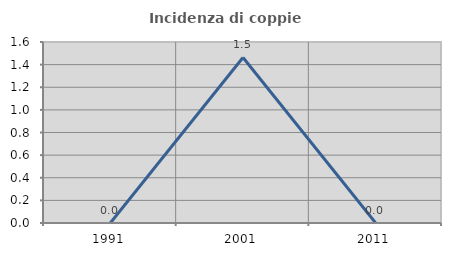
| Category | Incidenza di coppie miste |
|---|---|
| 1991.0 | 0 |
| 2001.0 | 1.463 |
| 2011.0 | 0 |